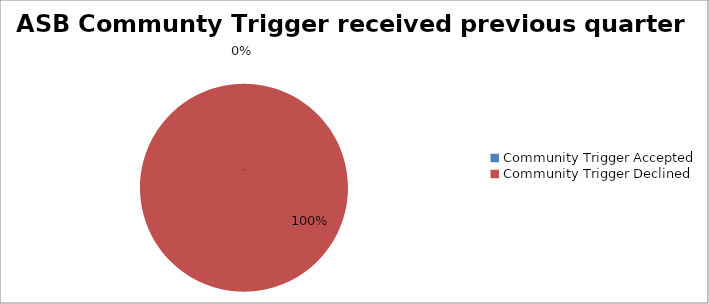
| Category | Series 0 |
|---|---|
| Community Trigger Accepted | 0 |
| Community Trigger Declined | 6 |